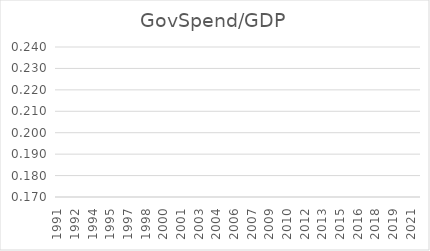
| Category | GovSpend/GDP |
|---|---|
| 1991.0 | 0 |
| 1991.0 | 0 |
| 1991.0 | 0 |
| 1991.0 | 0 |
| 1992.0 | 0 |
| 1992.0 | 0 |
| 1992.0 | 0 |
| 1992.0 | 0 |
| 1993.0 | 0 |
| 1993.0 | 0 |
| 1993.0 | 0 |
| 1993.0 | 0 |
| 1994.0 | 0 |
| 1994.0 | 0 |
| 1994.0 | 0 |
| 1994.0 | 0 |
| 1995.0 | 0 |
| 1995.0 | 0 |
| 1995.0 | 0 |
| 1995.0 | 0 |
| 1996.0 | 0 |
| 1996.0 | 0 |
| 1996.0 | 0 |
| 1996.0 | 0 |
| 1997.0 | 0 |
| 1997.0 | 0 |
| 1997.0 | 0 |
| 1997.0 | 0 |
| 1998.0 | 0 |
| 1998.0 | 0 |
| 1998.0 | 0 |
| 1998.0 | 0 |
| 1999.0 | 0 |
| 1999.0 | 0 |
| 1999.0 | 0 |
| 1999.0 | 0 |
| 2000.0 | 0 |
| 2000.0 | 0 |
| 2000.0 | 0 |
| 2000.0 | 0 |
| 2001.0 | 0 |
| 2001.0 | 0 |
| 2001.0 | 0 |
| 2001.0 | 0 |
| 2002.0 | 0 |
| 2002.0 | 0 |
| 2002.0 | 0 |
| 2002.0 | 0 |
| 2003.0 | 0 |
| 2003.0 | 0 |
| 2003.0 | 0 |
| 2003.0 | 0 |
| 2004.0 | 0 |
| 2004.0 | 0 |
| 2004.0 | 0 |
| 2004.0 | 0 |
| 2005.0 | 0 |
| 2005.0 | 0 |
| 2005.0 | 0 |
| 2005.0 | 0 |
| 2006.0 | 0 |
| 2006.0 | 0 |
| 2006.0 | 0 |
| 2006.0 | 0 |
| 2007.0 | 0 |
| 2007.0 | 0 |
| 2007.0 | 0 |
| 2007.0 | 0 |
| 2008.0 | 0 |
| 2008.0 | 0 |
| 2008.0 | 0 |
| 2008.0 | 0 |
| 2009.0 | 0 |
| 2009.0 | 0 |
| 2009.0 | 0 |
| 2009.0 | 0 |
| 2010.0 | 0 |
| 2010.0 | 0 |
| 2010.0 | 0 |
| 2010.0 | 0 |
| 2011.0 | 0 |
| 2011.0 | 0 |
| 2011.0 | 0 |
| 2011.0 | 0 |
| 2012.0 | 0 |
| 2012.0 | 0 |
| 2012.0 | 0 |
| 2012.0 | 0 |
| 2013.0 | 0 |
| 2013.0 | 0 |
| 2013.0 | 0 |
| 2013.0 | 0 |
| 2014.0 | 0 |
| 2014.0 | 0 |
| 2014.0 | 0 |
| 2014.0 | 0 |
| 2015.0 | 0 |
| 2015.0 | 0 |
| 2015.0 | 0 |
| 2015.0 | 0 |
| 2016.0 | 0 |
| 2016.0 | 0 |
| 2016.0 | 0 |
| 2016.0 | 0 |
| 2017.0 | 0 |
| 2017.0 | 0 |
| 2017.0 | 0 |
| 2017.0 | 0 |
| 2018.0 | 0 |
| 2018.0 | 0 |
| 2018.0 | 0 |
| 2018.0 | 0 |
| 2019.0 | 0 |
| 2019.0 | 0 |
| 2019.0 | 0 |
| 2019.0 | 0 |
| 2020.0 | 0 |
| 2020.0 | 0 |
| 2020.0 | 0 |
| 2020.0 | 0 |
| 2021.0 | 0 |
| 2021.0 | 0 |
| 2021.0 | 0 |
| 2021.0 | 0 |